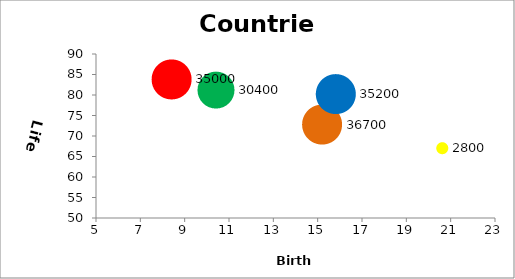
| Category | Series 0 |
|---|---|
| 15.2 | 72.79 |
| 8.39 | 83.91 |
| 20.6 | 67.14 |
| 15.8 | 80.32 |
| 10.4 | 81.27 |